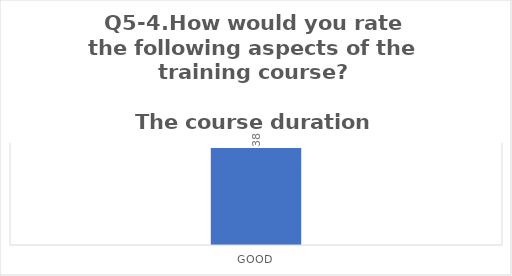
| Category | Q5-4.How would you rate the following aspects of the training course?

The course duration |
|---|---|
| Good | 38 |